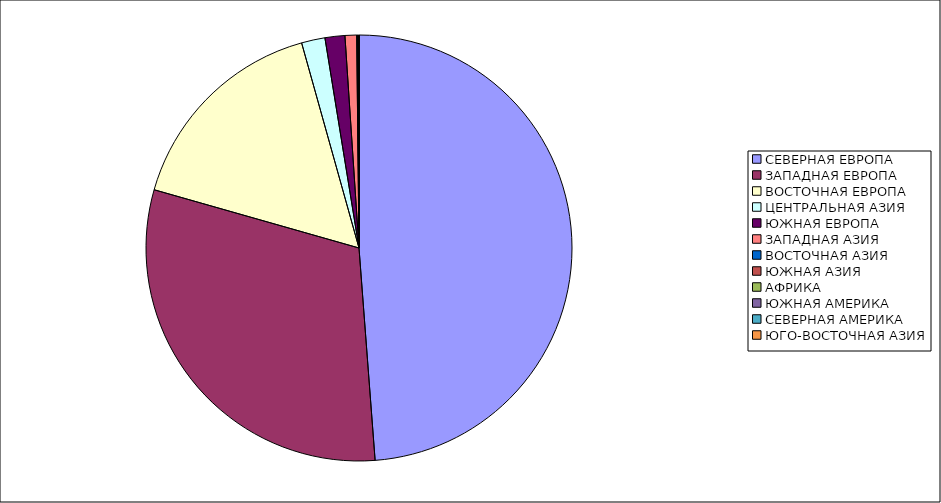
| Category | Оборот |
|---|---|
| СЕВЕРНАЯ ЕВРОПА | 48.793 |
| ЗАПАДНАЯ ЕВРОПА | 30.616 |
| ВОСТОЧНАЯ ЕВРОПА | 16.248 |
| ЦЕНТРАЛЬНАЯ АЗИЯ | 1.783 |
| ЮЖНАЯ ЕВРОПА | 1.507 |
| ЗАПАДНАЯ АЗИЯ | 0.881 |
| ВОСТОЧНАЯ АЗИЯ | 0.068 |
| ЮЖНАЯ АЗИЯ | 0.041 |
| АФРИКА | 0.034 |
| ЮЖНАЯ АМЕРИКА | 0.023 |
| СЕВЕРНАЯ АМЕРИКА | 0.005 |
| ЮГО-ВОСТОЧНАЯ АЗИЯ | 0.001 |